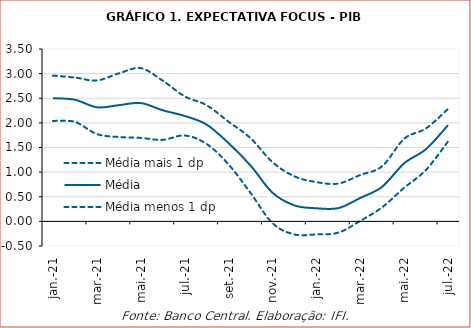
| Category | Média mais 1 dp | Média | Média menos 1 dp |
|---|---|---|---|
| 2021-01-01 | 2.96 | 2.5 | 2.04 |
| 2021-02-01 | 2.92 | 2.47 | 2.02 |
| 2021-03-01 | 2.86 | 2.316 | 1.773 |
| 2021-04-01 | 3.005 | 2.359 | 1.713 |
| 2021-05-01 | 3.111 | 2.403 | 1.695 |
| 2021-06-01 | 2.856 | 2.256 | 1.655 |
| 2021-07-01 | 2.539 | 2.141 | 1.743 |
| 2021-08-01 | 2.359 | 1.966 | 1.572 |
| 2021-09-01 | 2.024 | 1.59 | 1.156 |
| 2021-10-01 | 1.691 | 1.135 | 0.579 |
| 2021-11-01 | 1.203 | 0.584 | -0.035 |
| 2021-12-01 | 0.915 | 0.325 | -0.265 |
| 2022-01-01 | 0.798 | 0.266 | -0.265 |
| 2022-02-01 | 0.767 | 0.269 | -0.229 |
| 2022-03-01 | 0.942 | 0.475 | 0.009 |
| 2022-04-01 | 1.121 | 0.704 | 0.287 |
| 2022-05-01 | 1.676 | 1.179 | 0.682 |
| 2022-06-01 | 1.89 | 1.468 | 1.047 |
| 2022-07-01 | 2.283 | 1.953 | 1.623 |